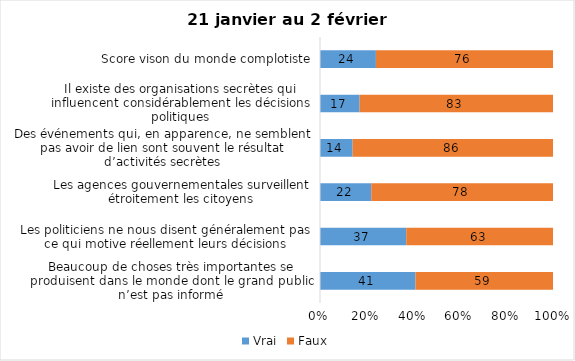
| Category | Vrai | Faux |
|---|---|---|
| Beaucoup de choses très importantes se produisent dans le monde dont le grand public n’est pas informé | 41 | 59 |
| Les politiciens ne nous disent généralement pas ce qui motive réellement leurs décisions | 37 | 63 |
| Les agences gouvernementales surveillent étroitement les citoyens | 22 | 78 |
| Des événements qui, en apparence, ne semblent pas avoir de lien sont souvent le résultat d’activités secrètes | 14 | 86 |
| Il existe des organisations secrètes qui influencent considérablement les décisions politiques | 17 | 83 |
| Score vison du monde complotiste | 24 | 76 |